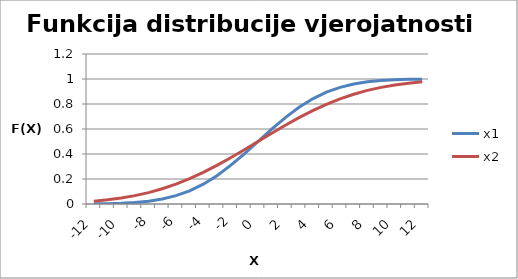
| Category | x1 | x2 |
|---|---|---|
| -12.0 | 0.001 | 0.023 |
| -11.0 | 0.003 | 0.033 |
| -10.0 | 0.006 | 0.048 |
| -9.0 | 0.012 | 0.067 |
| -8.0 | 0.023 | 0.091 |
| -7.0 | 0.04 | 0.122 |
| -6.0 | 0.067 | 0.159 |
| -5.0 | 0.106 | 0.202 |
| -4.0 | 0.159 | 0.252 |
| -3.0 | 0.227 | 0.309 |
| -2.0 | 0.309 | 0.369 |
| -1.0 | 0.401 | 0.434 |
| 0.0 | 0.5 | 0.5 |
| 1.0 | 0.599 | 0.566 |
| 2.0 | 0.691 | 0.631 |
| 3.0 | 0.773 | 0.691 |
| 4.0 | 0.841 | 0.748 |
| 5.0 | 0.894 | 0.798 |
| 6.0 | 0.933 | 0.841 |
| 7.0 | 0.96 | 0.878 |
| 8.0 | 0.977 | 0.909 |
| 9.0 | 0.988 | 0.933 |
| 10.0 | 0.994 | 0.952 |
| 11.0 | 0.997 | 0.967 |
| 12.0 | 0.999 | 0.977 |